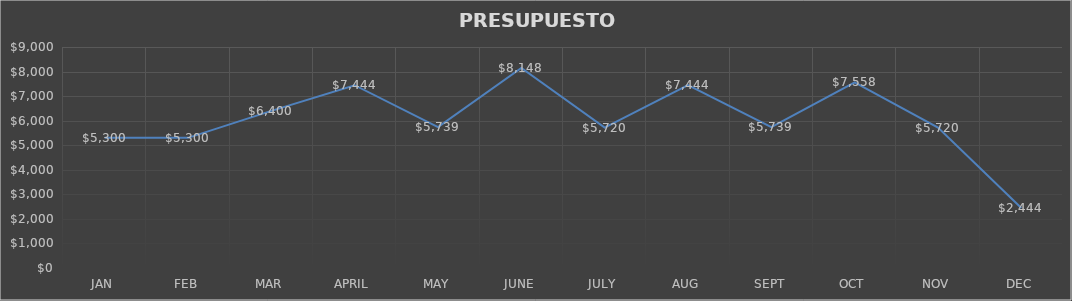
| Category | Series 0 |
|---|---|
| JAN | 5300 |
| FEB | 5300 |
| MAR | 6400 |
| APRIL | 7444 |
| MAY | 5739 |
| JUNE | 8148 |
| JULY | 5720 |
| AUG | 7444 |
| SEPT | 5739 |
| OCT | 7558 |
| NOV | 5720 |
| DEC | 2444 |